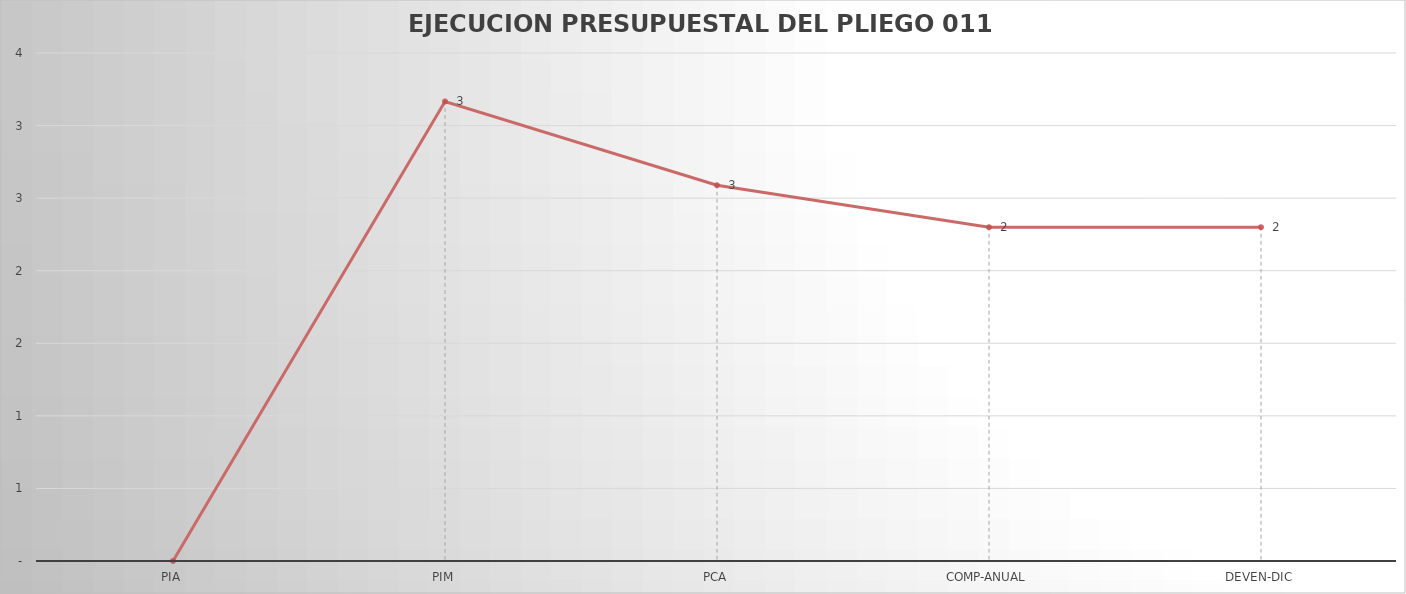
| Category | Series 0 |
|---|---|
| PIA | 0 |
| PIM | 3.166 |
| PCA | 2.589 |
| COMP-ANUAL | 2.3 |
| DEVEN-DIC | 2.3 |